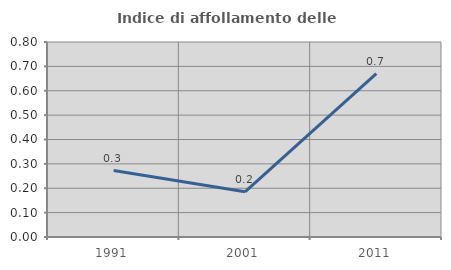
| Category | Indice di affollamento delle abitazioni  |
|---|---|
| 1991.0 | 0.273 |
| 2001.0 | 0.185 |
| 2011.0 | 0.67 |